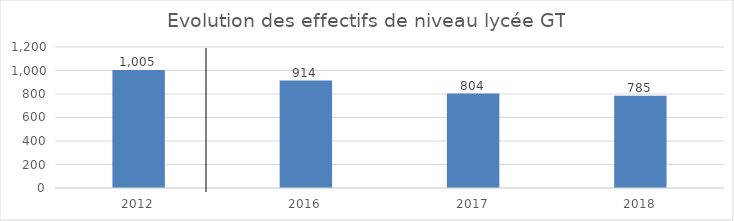
| Category | Series 0 |
|---|---|
| 2012.0 | 1005 |
| 2016.0 | 914 |
| 2017.0 | 804 |
| 2018.0 | 785 |